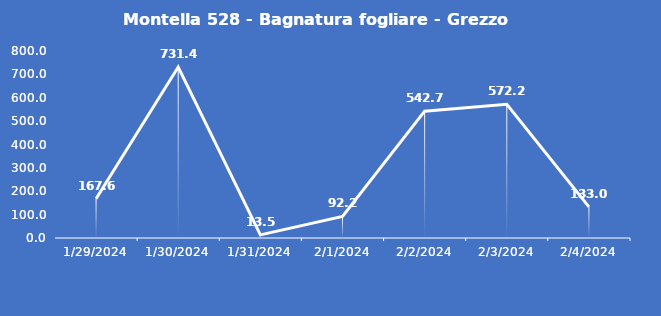
| Category | Montella 528 - Bagnatura fogliare - Grezzo (min) |
|---|---|
| 1/29/24 | 167.6 |
| 1/30/24 | 731.4 |
| 1/31/24 | 13.5 |
| 2/1/24 | 92.2 |
| 2/2/24 | 542.7 |
| 2/3/24 | 572.2 |
| 2/4/24 | 133 |